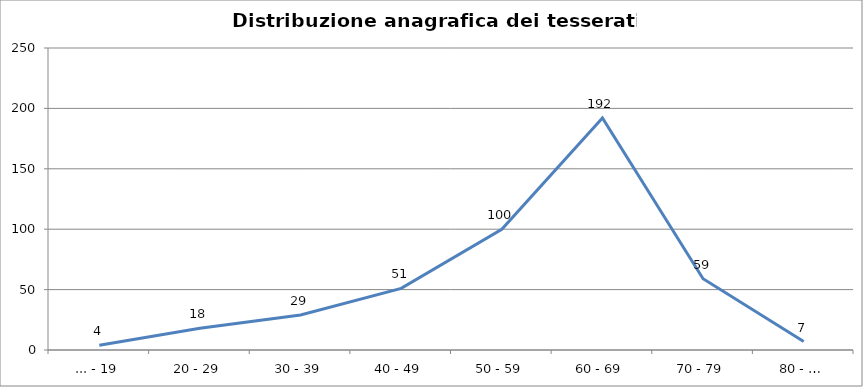
| Category | Nr. Tesserati |
|---|---|
| ... - 19 | 4 |
| 20 - 29 | 18 |
| 30 - 39 | 29 |
| 40 - 49 | 51 |
| 50 - 59 | 100 |
| 60 - 69 | 192 |
| 70 - 79 | 59 |
| 80 - … | 7 |